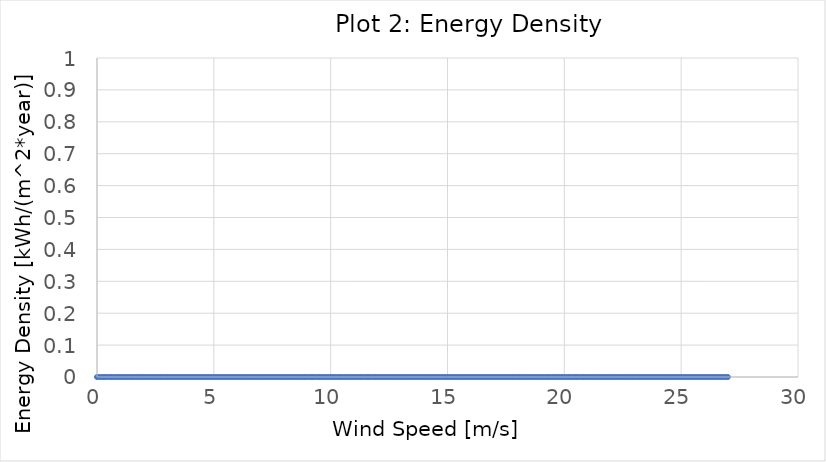
| Category | Series 0 |
|---|---|
| 0.0 | 0 |
| 0.1 | 0 |
| 0.2 | 0 |
| 0.3 | 0 |
| 0.4 | 0 |
| 0.5 | 0 |
| 0.6 | 0 |
| 0.7 | 0 |
| 0.8 | 0 |
| 0.9 | 0 |
| 1.0 | 0 |
| 1.1 | 0 |
| 1.2 | 0 |
| 1.3 | 0 |
| 1.4 | 0 |
| 1.5 | 0 |
| 1.6 | 0 |
| 1.7 | 0 |
| 1.8 | 0 |
| 1.9 | 0 |
| 2.0 | 0 |
| 2.1 | 0 |
| 2.2 | 0 |
| 2.3 | 0 |
| 2.4 | 0 |
| 2.5 | 0 |
| 2.6 | 0 |
| 2.7 | 0 |
| 2.8 | 0 |
| 2.9 | 0 |
| 3.0 | 0 |
| 3.1 | 0 |
| 3.2 | 0 |
| 3.3 | 0 |
| 3.4 | 0 |
| 3.5 | 0 |
| 3.6 | 0 |
| 3.7 | 0 |
| 3.8 | 0 |
| 3.9 | 0 |
| 4.0 | 0 |
| 4.1 | 0 |
| 4.2 | 0 |
| 4.3 | 0 |
| 4.4 | 0 |
| 4.5 | 0 |
| 4.6 | 0 |
| 4.7 | 0 |
| 4.8 | 0 |
| 4.9 | 0 |
| 5.0 | 0 |
| 5.1 | 0 |
| 5.2 | 0 |
| 5.3 | 0 |
| 5.4 | 0 |
| 5.5 | 0 |
| 5.6 | 0 |
| 5.7 | 0 |
| 5.8 | 0 |
| 5.9 | 0 |
| 6.0 | 0 |
| 6.1 | 0 |
| 6.2 | 0 |
| 6.3 | 0 |
| 6.4 | 0 |
| 6.5 | 0 |
| 6.6 | 0 |
| 6.7 | 0 |
| 6.8 | 0 |
| 6.9 | 0 |
| 7.0 | 0 |
| 7.1 | 0 |
| 7.2 | 0 |
| 7.3 | 0 |
| 7.4 | 0 |
| 7.5 | 0 |
| 7.6 | 0 |
| 7.7 | 0 |
| 7.8 | 0 |
| 7.9 | 0 |
| 8.0 | 0 |
| 8.1 | 0 |
| 8.2 | 0 |
| 8.3 | 0 |
| 8.4 | 0 |
| 8.5 | 0 |
| 8.6 | 0 |
| 8.7 | 0 |
| 8.8 | 0 |
| 8.9 | 0 |
| 9.0 | 0 |
| 9.1 | 0 |
| 9.2 | 0 |
| 9.3 | 0 |
| 9.4 | 0 |
| 9.5 | 0 |
| 9.6 | 0 |
| 9.7 | 0 |
| 9.8 | 0 |
| 9.9 | 0 |
| 10.0 | 0 |
| 10.1 | 0 |
| 10.2 | 0 |
| 10.3 | 0 |
| 10.4 | 0 |
| 10.5 | 0 |
| 10.6 | 0 |
| 10.7 | 0 |
| 10.8 | 0 |
| 10.9 | 0 |
| 11.0 | 0 |
| 11.1 | 0 |
| 11.2 | 0 |
| 11.3 | 0 |
| 11.4 | 0 |
| 11.5 | 0 |
| 11.6 | 0 |
| 11.7 | 0 |
| 11.8 | 0 |
| 11.9 | 0 |
| 12.0 | 0 |
| 12.1 | 0 |
| 12.2 | 0 |
| 12.3 | 0 |
| 12.4 | 0 |
| 12.5 | 0 |
| 12.6 | 0 |
| 12.7 | 0 |
| 12.8 | 0 |
| 12.9 | 0 |
| 13.0 | 0 |
| 13.1 | 0 |
| 13.2 | 0 |
| 13.3 | 0 |
| 13.4 | 0 |
| 13.5 | 0 |
| 13.6 | 0 |
| 13.7 | 0 |
| 13.8 | 0 |
| 13.9 | 0 |
| 14.0 | 0 |
| 14.1 | 0 |
| 14.2 | 0 |
| 14.3 | 0 |
| 14.4 | 0 |
| 14.5 | 0 |
| 14.6 | 0 |
| 14.7 | 0 |
| 14.8 | 0 |
| 14.9 | 0 |
| 15.0 | 0 |
| 15.1 | 0 |
| 15.2 | 0 |
| 15.3 | 0 |
| 15.4 | 0 |
| 15.5 | 0 |
| 15.6 | 0 |
| 15.7 | 0 |
| 15.8 | 0 |
| 15.9 | 0 |
| 16.0 | 0 |
| 16.1 | 0 |
| 16.2 | 0 |
| 16.3 | 0 |
| 16.4 | 0 |
| 16.5 | 0 |
| 16.6 | 0 |
| 16.7 | 0 |
| 16.8 | 0 |
| 16.9 | 0 |
| 17.0 | 0 |
| 17.1 | 0 |
| 17.2 | 0 |
| 17.3 | 0 |
| 17.4 | 0 |
| 17.5 | 0 |
| 17.6 | 0 |
| 17.7 | 0 |
| 17.8 | 0 |
| 17.9 | 0 |
| 18.0 | 0 |
| 18.1 | 0 |
| 18.2 | 0 |
| 18.3 | 0 |
| 18.4 | 0 |
| 18.5 | 0 |
| 18.6 | 0 |
| 18.7 | 0 |
| 18.8 | 0 |
| 18.9 | 0 |
| 19.0 | 0 |
| 19.1 | 0 |
| 19.2 | 0 |
| 19.3 | 0 |
| 19.4 | 0 |
| 19.5 | 0 |
| 19.6 | 0 |
| 19.7 | 0 |
| 19.8 | 0 |
| 19.9 | 0 |
| 20.0 | 0 |
| 20.1 | 0 |
| 20.2 | 0 |
| 20.3 | 0 |
| 20.4 | 0 |
| 20.5 | 0 |
| 20.6 | 0 |
| 20.7 | 0 |
| 20.8 | 0 |
| 20.9 | 0 |
| 21.0 | 0 |
| 21.1 | 0 |
| 21.2 | 0 |
| 21.3 | 0 |
| 21.4 | 0 |
| 21.5 | 0 |
| 21.6 | 0 |
| 21.7 | 0 |
| 21.8 | 0 |
| 21.9 | 0 |
| 22.0 | 0 |
| 22.1 | 0 |
| 22.2 | 0 |
| 22.3 | 0 |
| 22.4 | 0 |
| 22.5 | 0 |
| 22.6 | 0 |
| 22.7 | 0 |
| 22.8 | 0 |
| 22.9 | 0 |
| 23.0 | 0 |
| 23.1 | 0 |
| 23.2 | 0 |
| 23.3 | 0 |
| 23.4 | 0 |
| 23.5 | 0 |
| 23.6 | 0 |
| 23.7 | 0 |
| 23.8 | 0 |
| 23.9 | 0 |
| 24.0 | 0 |
| 24.1 | 0 |
| 24.2 | 0 |
| 24.3 | 0 |
| 24.4 | 0 |
| 24.5 | 0 |
| 24.6 | 0 |
| 24.7 | 0 |
| 24.8 | 0 |
| 24.9 | 0 |
| 25.0 | 0 |
| 25.1 | 0 |
| 25.2 | 0 |
| 25.3 | 0 |
| 25.4 | 0 |
| 25.5 | 0 |
| 25.6 | 0 |
| 25.7 | 0 |
| 25.8 | 0 |
| 25.9 | 0 |
| 26.0 | 0 |
| 26.1 | 0 |
| 26.2 | 0 |
| 26.3 | 0 |
| 26.4 | 0 |
| 26.5 | 0 |
| 26.6 | 0 |
| 26.7 | 0 |
| 26.8 | 0 |
| 26.9 | 0 |
| 27.0 | 0 |